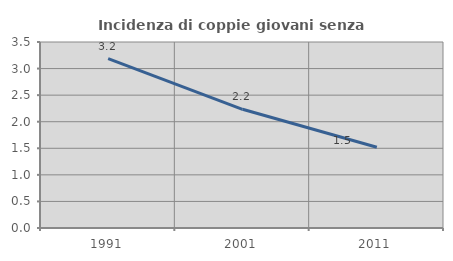
| Category | Incidenza di coppie giovani senza figli |
|---|---|
| 1991.0 | 3.186 |
| 2001.0 | 2.234 |
| 2011.0 | 1.52 |